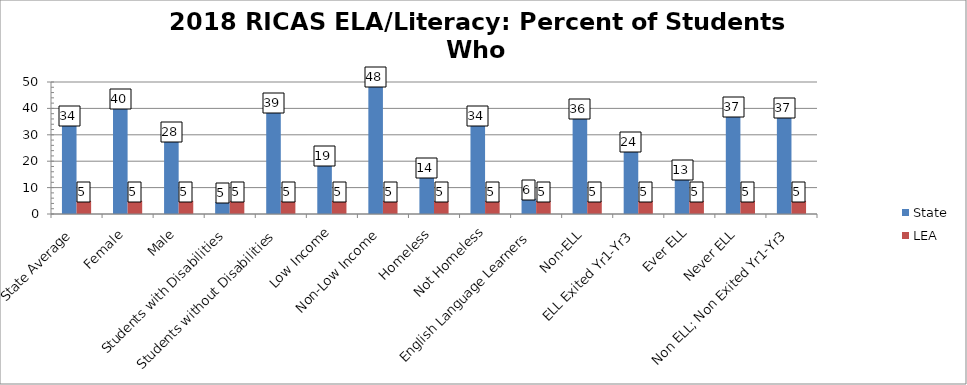
| Category | State | LEA |
|---|---|---|
| State Average | 33.7 | 5 |
| Female | 40 | 5 |
| Male | 27.7 | 5 |
| Students with Disabilities | 4.5 | 5 |
| Students without Disabilities | 38.7 | 5 |
| Low Income | 18.6 | 5 |
| Non-Low Income | 48.3 | 5 |
| Homeless | 14.2 | 5 |
| Not Homeless | 33.9 | 5 |
| English Language Learners | 5.8 | 5 |
| Non-ELL | 36.3 | 5 |
| ELL Exited Yr1-Yr3 | 23.7 | 5 |
| Ever ELL | 13.2 | 5 |
| Never ELL | 37.2 | 5 |
| Non ELL; Non Exited Yr1-Yr3 | 36.8 | 5 |